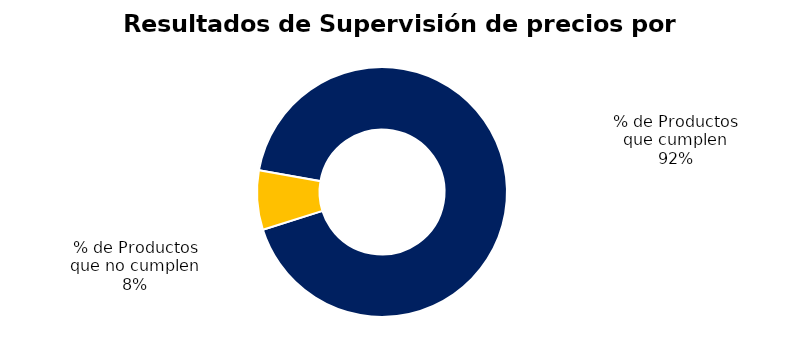
| Category | Series 0 |
|---|---|
| % de Productos que cumplen | 169 |
| % de Productos que no cumplen | 14 |